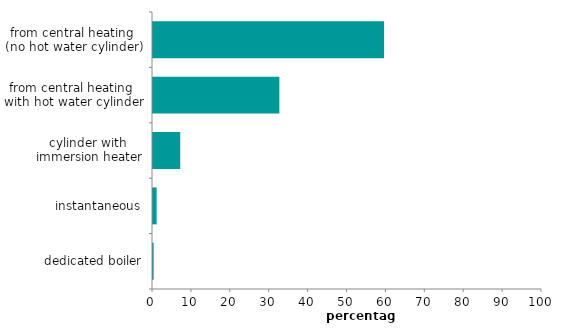
| Category | Series 1 |
|---|---|
| dedicated boiler | 0.17 |
| instantaneous | 0.93 |
| cylinder with 
immersion heater | 7 |
| from central heating 
with hot water cylinder | 32.487 |
| from central heating 
(no hot water cylinder) | 59.413 |